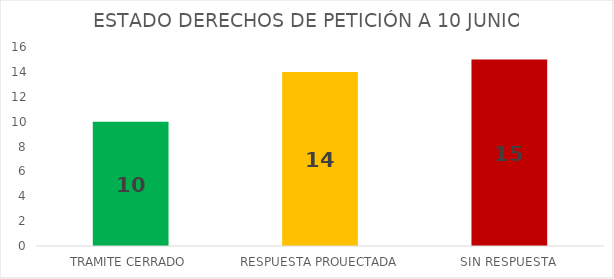
| Category | Series 0 |
|---|---|
| TRAMITE CERRADO | 10 |
| RESPUESTA PROUECTADA | 14 |
| SIN RESPUESTA | 15 |